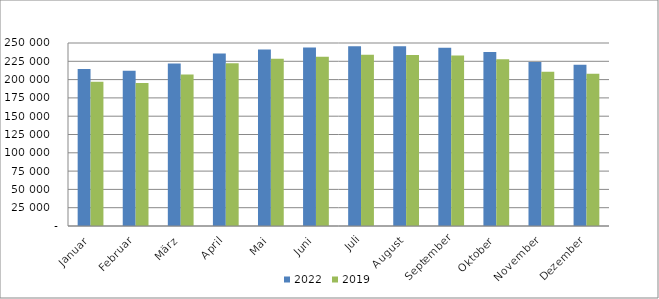
| Category | 2022 | 2019 |
|---|---|---|
| Januar | 214429 | 197233 |
| Februar | 212210 | 195227 |
| März | 221960 | 207079 |
| April | 235651 | 222430 |
| Mai | 240984 | 228514 |
| Juni | 243781 | 231048 |
| Juli | 245413 | 233904 |
| August | 245717 | 233468 |
| September | 243363 | 232871 |
| Oktober | 237801 | 227830 |
| November | 223883 | 210604 |
| Dezember | 220165 | 208136 |